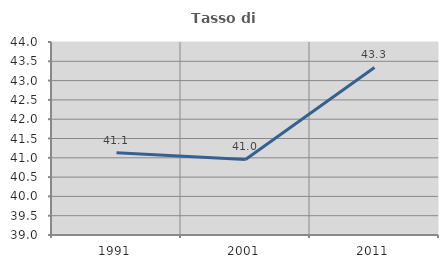
| Category | Tasso di occupazione   |
|---|---|
| 1991.0 | 41.13 |
| 2001.0 | 40.958 |
| 2011.0 | 43.34 |